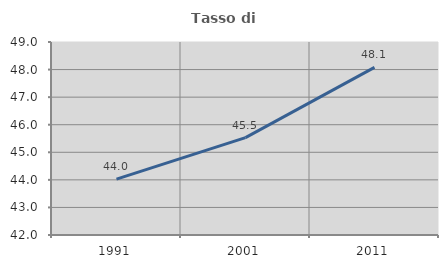
| Category | Tasso di occupazione   |
|---|---|
| 1991.0 | 44.028 |
| 2001.0 | 45.532 |
| 2011.0 | 48.079 |